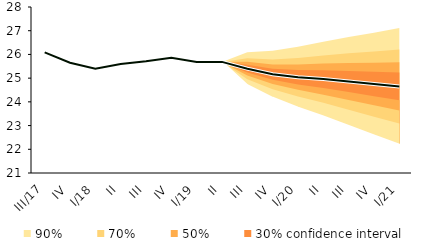
| Category | linka | Centerline |
|---|---|---|
| 0 | 26.084 | 26.084 |
| 1 | 25.651 | 25.651 |
| 2 | 25.402 | 25.402 |
| 3 | 25.599 | 25.599 |
| 4 | 25.711 | 25.711 |
| 5 | 25.862 | 25.862 |
| 6 | 25.682 | 25.682 |
| 7 | 25.685 | 25.685 |
| 8 | 25.4 | 25.4 |
| 9 | 25.163 | 25.163 |
| 10 | 25.039 | 25.039 |
| 11 | 24.959 | 24.959 |
| 12 | 24.859 | 24.859 |
| 13 | 24.751 | 24.751 |
| 14 | 24.652 | 24.652 |